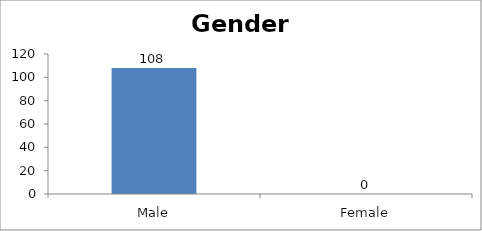
| Category | Gender |
|---|---|
| Male | 108 |
| Female | 0 |